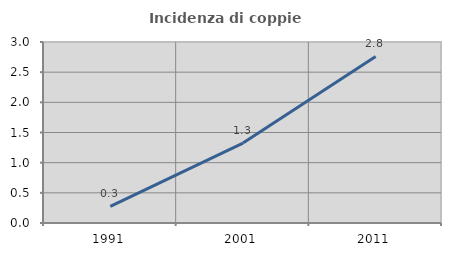
| Category | Incidenza di coppie miste |
|---|---|
| 1991.0 | 0.275 |
| 2001.0 | 1.325 |
| 2011.0 | 2.76 |